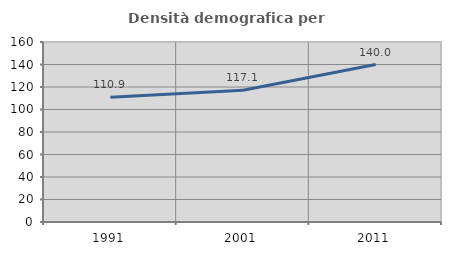
| Category | Densità demografica |
|---|---|
| 1991.0 | 110.877 |
| 2001.0 | 117.114 |
| 2011.0 | 139.982 |